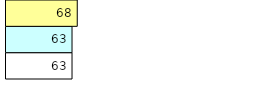
| Category | Total Standouts | Total Recd | Total Tipsters |
|---|---|---|---|
| 0 | 63 | 63 | 68 |